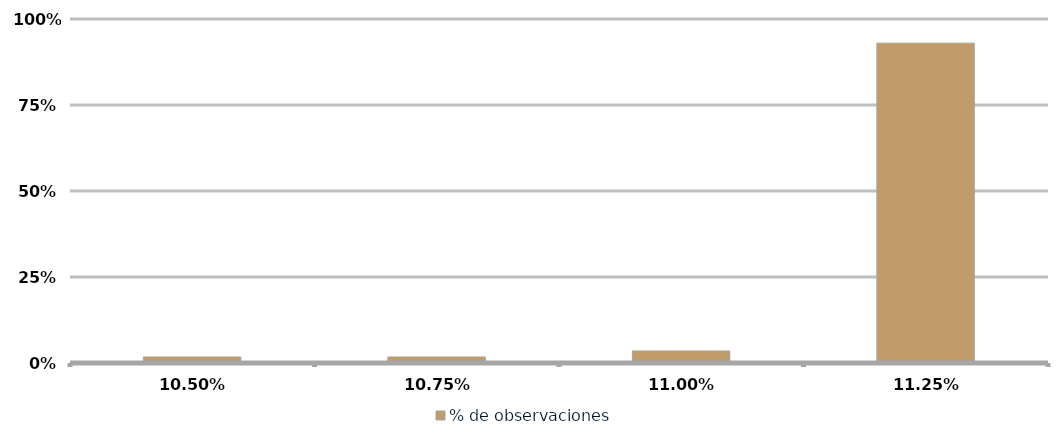
| Category | % de observaciones  |
|---|---|
| 0.105 | 0.018 |
| 0.1075 | 0.018 |
| 0.11 | 0.035 |
| 0.1125 | 0.93 |